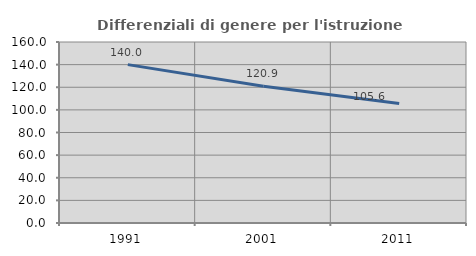
| Category | Differenziali di genere per l'istruzione superiore |
|---|---|
| 1991.0 | 140.01 |
| 2001.0 | 120.9 |
| 2011.0 | 105.605 |